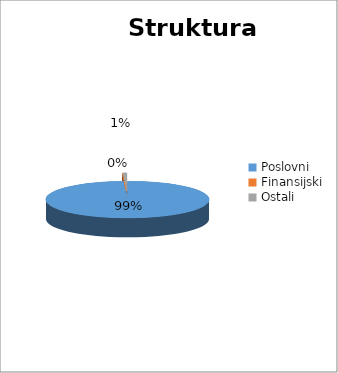
| Category | Series 0 |
|---|---|
| Poslovni | 265587 |
| Finansijski  | 5 |
| Ostali  | 2097 |